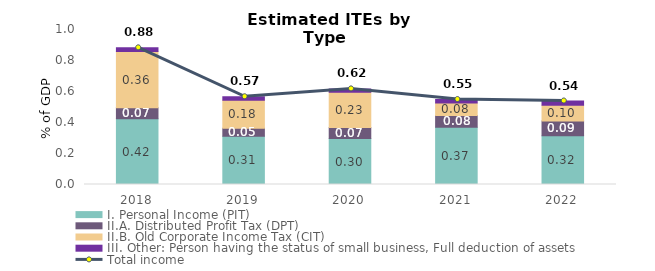
| Category | I. Personal Income (PIT) | II.A. Distributed Profit Tax (DPT) | II.B. Old Corporate Income Tax (CIT) | III. Other: Person having the status of small business, Full deduction of assets |
|---|---|---|---|---|
| 2018.0 | 0.424 | 0.071 | 0.364 | 0.023 |
| 2019.0 | 0.311 | 0.052 | 0.181 | 0.022 |
| 2020.0 | 0.296 | 0.071 | 0.228 | 0.021 |
| 2021.0 | 0.37 | 0.076 | 0.08 | 0.023 |
| 2022.0 | 0.315 | 0.094 | 0.102 | 0.028 |